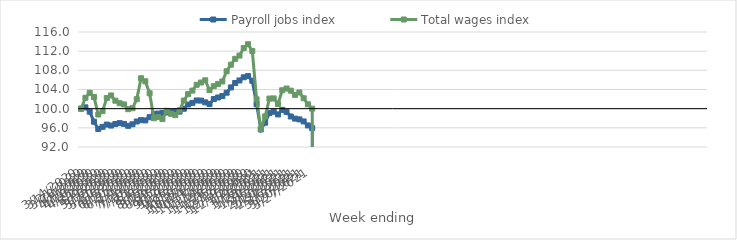
| Category | Payroll jobs index | Total wages index |
|---|---|---|
| 14/03/2020 | 100 | 100 |
| 21/03/2020 | 100.276 | 102.275 |
| 28/03/2020 | 99.371 | 103.314 |
| 04/04/2020 | 97.277 | 102.439 |
| 11/04/2020 | 95.764 | 98.78 |
| 18/04/2020 | 96.205 | 99.489 |
| 25/04/2020 | 96.682 | 102.215 |
| 02/05/2020 | 96.477 | 102.76 |
| 09/05/2020 | 96.806 | 101.664 |
| 16/05/2020 | 96.986 | 101.137 |
| 23/05/2020 | 96.822 | 100.881 |
| 30/05/2020 | 96.419 | 99.894 |
| 06/06/2020 | 96.742 | 100.1 |
| 13/06/2020 | 97.323 | 101.978 |
| 20/06/2020 | 97.606 | 106.346 |
| 27/06/2020 | 97.547 | 105.715 |
| 04/07/2020 | 98.222 | 103.218 |
| 11/07/2020 | 98.925 | 98.006 |
| 18/07/2020 | 98.97 | 98.242 |
| 25/07/2020 | 99.108 | 97.818 |
| 01/08/2020 | 99.212 | 99.559 |
| 08/08/2020 | 99.373 | 98.927 |
| 15/08/2020 | 99.4 | 98.645 |
| 22/08/2020 | 99.391 | 99.654 |
| 29/08/2020 | 99.988 | 101.693 |
| 05/09/2020 | 100.873 | 103.037 |
| 12/09/2020 | 101.211 | 103.765 |
| 19/09/2020 | 101.713 | 104.985 |
| 26/09/2020 | 101.686 | 105.455 |
| 03/10/2020 | 101.318 | 105.919 |
| 10/10/2020 | 100.967 | 103.873 |
| 17/10/2020 | 102.007 | 104.689 |
| 24/10/2020 | 102.325 | 105.165 |
| 31/10/2020 | 102.631 | 105.674 |
| 07/11/2020 | 103.334 | 107.802 |
| 14/11/2020 | 104.428 | 109.176 |
| 21/11/2020 | 105.353 | 110.404 |
| 28/11/2020 | 105.89 | 111.076 |
| 05/12/2020 | 106.551 | 112.656 |
| 12/12/2020 | 106.794 | 113.444 |
| 19/12/2020 | 105.823 | 112.038 |
| 26/12/2020 | 100.934 | 101.95 |
| 02/01/2021 | 95.664 | 95.74 |
| 09/01/2021 | 97.072 | 98.395 |
| 16/01/2021 | 99.069 | 102.102 |
| 23/01/2021 | 99.363 | 102.136 |
| 30/01/2021 | 98.799 | 100.986 |
| 06/02/2021 | 99.752 | 103.841 |
| 13/02/2021 | 99.328 | 104.201 |
| 20/02/2021 | 98.369 | 103.753 |
| 27/02/2021 | 97.927 | 102.878 |
| 06/03/2021 | 97.764 | 103.38 |
| 13/03/2021 | 97.336 | 102.172 |
| 20/03/2021 | 96.497 | 100.903 |
| 27/03/2021 | 95.943 | 99.999 |